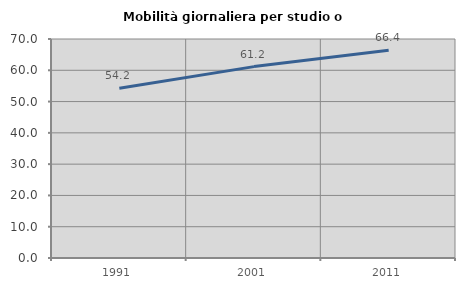
| Category | Mobilità giornaliera per studio o lavoro |
|---|---|
| 1991.0 | 54.231 |
| 2001.0 | 61.174 |
| 2011.0 | 66.406 |